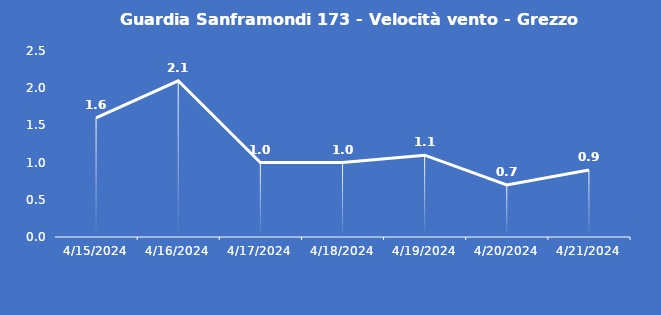
| Category | Guardia Sanframondi 173 - Velocità vento - Grezzo (m/s) |
|---|---|
| 4/15/24 | 1.6 |
| 4/16/24 | 2.1 |
| 4/17/24 | 1 |
| 4/18/24 | 1 |
| 4/19/24 | 1.1 |
| 4/20/24 | 0.7 |
| 4/21/24 | 0.9 |